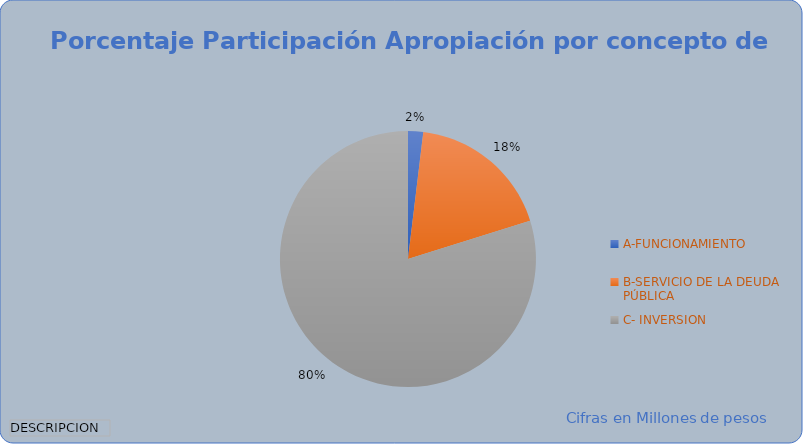
| Category | Total |
|---|---|
| A-FUNCIONAMIENTO | 101565.565 |
| B-SERVICIO DE LA DEUDA PÚBLICA | 969198.471 |
| C- INVERSION | 4237527.256 |